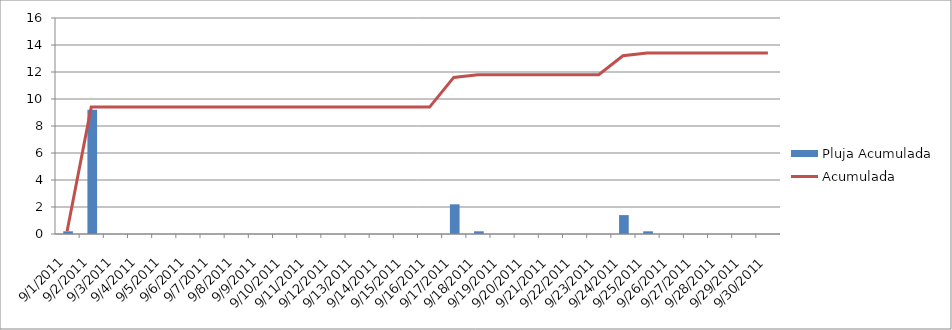
| Category | Pluja Acumulada |
|---|---|
| 01/09/2011 | 0.2 |
| 02/09/2011 | 9.2 |
| 03/09/2011 | 0 |
| 04/09/2011 | 0 |
| 05/09/2011 | 0 |
| 06/09/2011 | 0 |
| 07/09/2011 | 0 |
| 08/09/2011 | 0 |
| 09/09/2011 | 0 |
| 10/09/2011 | 0 |
| 11/09/2011 | 0 |
| 12/09/2011 | 0 |
| 13/09/2011 | 0 |
| 14/09/2011 | 0 |
| 15/09/2011 | 0 |
| 16/09/2011 | 0 |
| 17/09/2011 | 2.2 |
| 18/09/2011 | 0.2 |
| 19/09/2011 | 0 |
| 20/09/2011 | 0 |
| 21/09/2011 | 0 |
| 22/09/2011 | 0 |
| 23/09/2011 | 0 |
| 24/09/2011 | 1.4 |
| 25/09/2011 | 0.2 |
| 26/09/2011 | 0 |
| 27/09/2011 | 0 |
| 28/09/2011 | 0 |
| 29/09/2011 | 0 |
| 30/09/2011 | 0 |